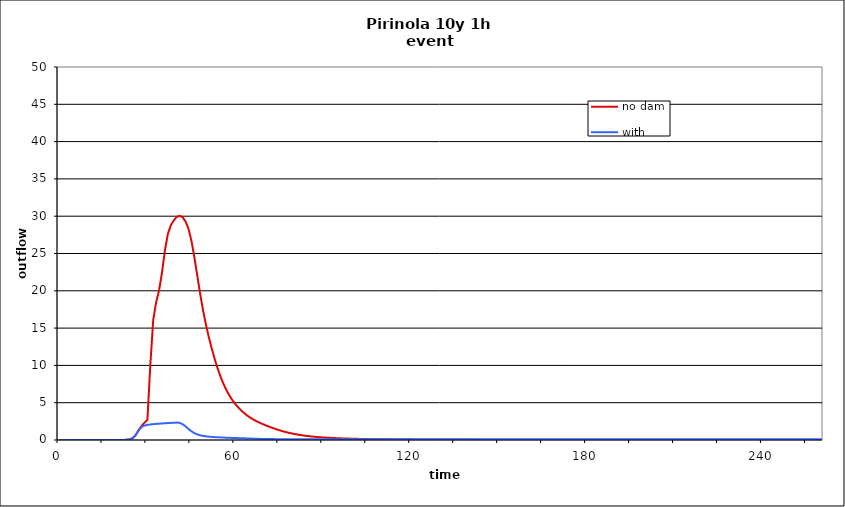
| Category | no dam | with dam |
|---|---|---|
| 0.0 | 0 | 0 |
| 1.0 | 0 | 0 |
| 2.0 | 0 | 0 |
| 3.0 | 0 | 0 |
| 4.0 | 0 | 0 |
| 5.0 | 0 | 0 |
| 6.0 | 0 | 0 |
| 7.0 | 0 | 0 |
| 8.0 | 0 | 0 |
| 9.0 | 0 | 0 |
| 10.0 | 0 | 0 |
| 11.0 | 0 | 0 |
| 12.0 | 0 | 0 |
| 13.0 | 0 | 0 |
| 14.0 | 0 | 0 |
| 15.0 | 0 | 0 |
| 16.0 | 0 | 0 |
| 17.0 | 0 | 0 |
| 18.0 | 0 | 0 |
| 19.0 | 0 | 0 |
| 20.0 | 0 | 0 |
| 21.0 | 0.002 | 0.002 |
| 22.0 | 0.01 | 0.01 |
| 23.0 | 0.037 | 0.037 |
| 24.0 | 0.088 | 0.088 |
| 25.0 | 0.271 | 0.249 |
| 26.0 | 0.672 | 0.624 |
| 27.0 | 1.334 | 1.276 |
| 28.0 | 1.887 | 1.736 |
| 29.0 | 2.307 | 1.935 |
| 30.0 | 2.689 | 2.026 |
| 31.0 | 10.1 | 2.082 |
| 32.0 | 16.131 | 2.125 |
| 33.0 | 18.484 | 2.159 |
| 34.0 | 20.099 | 2.19 |
| 35.0 | 22.505 | 2.219 |
| 36.0 | 25.489 | 2.246 |
| 37.0 | 27.645 | 2.27 |
| 38.0 | 28.788 | 2.293 |
| 39.0 | 29.443 | 2.316 |
| 40.0 | 29.899 | 2.337 |
| 41.0 | 30.048 | 2.303 |
| 42.0 | 29.859 | 2.121 |
| 43.0 | 29.318 | 1.828 |
| 44.0 | 28.336 | 1.489 |
| 45.0 | 26.744 | 1.173 |
| 46.0 | 24.56 | 0.929 |
| 47.0 | 22.075 | 0.755 |
| 48.0 | 19.6 | 0.633 |
| 49.0 | 17.356 | 0.548 |
| 50.0 | 15.411 | 0.487 |
| 51.0 | 13.714 | 0.444 |
| 52.0 | 12.189 | 0.412 |
| 53.0 | 10.8 | 0.387 |
| 54.0 | 9.549 | 0.364 |
| 55.0 | 8.439 | 0.344 |
| 56.0 | 7.479 | 0.325 |
| 57.0 | 6.649 | 0.307 |
| 58.0 | 5.94 | 0.289 |
| 59.0 | 5.333 | 0.274 |
| 60.0 | 4.816 | 0.261 |
| 61.0 | 4.364 | 0.25 |
| 62.0 | 3.966 | 0.238 |
| 63.0 | 3.611 | 0.225 |
| 64.0 | 3.297 | 0.211 |
| 65.0 | 3.02 | 0.196 |
| 66.0 | 2.776 | 0.181 |
| 67.0 | 2.561 | 0.167 |
| 68.0 | 2.366 | 0.155 |
| 69.0 | 2.188 | 0.145 |
| 70.0 | 2.023 | 0.136 |
| 71.0 | 1.866 | 0.129 |
| 72.0 | 1.718 | 0.123 |
| 73.0 | 1.576 | 0.118 |
| 74.0 | 1.441 | 0.114 |
| 75.0 | 1.315 | 0.112 |
| 76.0 | 1.198 | 0.109 |
| 77.0 | 1.091 | 0.107 |
| 78.0 | 0.992 | 0.106 |
| 79.0 | 0.902 | 0.105 |
| 80.0 | 0.82 | 0.104 |
| 81.0 | 0.745 | 0.103 |
| 82.0 | 0.677 | 0.103 |
| 83.0 | 0.616 | 0.102 |
| 84.0 | 0.561 | 0.102 |
| 85.0 | 0.513 | 0.101 |
| 86.0 | 0.47 | 0.101 |
| 87.0 | 0.432 | 0.101 |
| 88.0 | 0.399 | 0.101 |
| 89.0 | 0.369 | 0.1 |
| 90.0 | 0.342 | 0.1 |
| 91.0 | 0.317 | 0.1 |
| 92.0 | 0.295 | 0.1 |
| 93.0 | 0.274 | 0.1 |
| 94.0 | 0.256 | 0.1 |
| 95.0 | 0.238 | 0.1 |
| 96.0 | 0.222 | 0.1 |
| 97.0 | 0.208 | 0.1 |
| 98.0 | 0.194 | 0.1 |
| 99.0 | 0.182 | 0.1 |
| 100.0 | 0.17 | 0.1 |
| 101.0 | 0.159 | 0.1 |
| 102.0 | 0.149 | 0.1 |
| 103.0 | 0.14 | 0.1 |
| 104.0 | 0.132 | 0.1 |
| 105.0 | 0.124 | 0.1 |
| 106.0 | 0.116 | 0.1 |
| 107.0 | 0.109 | 0.1 |
| 108.0 | 0.103 | 0.1 |
| 109.0 | 0.097 | 0.1 |
| 110.0 | 0.091 | 0.1 |
| 111.0 | 0.086 | 0.1 |
| 112.0 | 0.081 | 0.1 |
| 113.0 | 0.077 | 0.1 |
| 114.0 | 0.072 | 0.1 |
| 115.0 | 0.068 | 0.1 |
| 116.0 | 0.065 | 0.1 |
| 117.0 | 0.061 | 0.1 |
| 118.0 | 0.058 | 0.1 |
| 119.0 | 0.055 | 0.1 |
| 120.0 | 0.052 | 0.1 |
| 121.0 | 0.049 | 0.1 |
| 122.0 | 0.046 | 0.1 |
| 123.0 | 0.044 | 0.1 |
| 124.0 | 0.042 | 0.1 |
| 125.0 | 0.04 | 0.1 |
| 126.0 | 0.038 | 0.1 |
| 127.0 | 0.036 | 0.1 |
| 128.0 | 0.034 | 0.1 |
| 129.0 | 0.032 | 0.1 |
| 130.0 | 0.031 | 0.1 |
| 131.0 | 0.029 | 0.1 |
| 132.0 | 0.028 | 0.1 |
| 133.0 | 0.026 | 0.1 |
| 134.0 | 0.025 | 0.1 |
| 135.0 | 0.024 | 0.1 |
| 136.0 | 0.023 | 0.1 |
| 137.0 | 0.022 | 0.1 |
| 138.0 | 0.021 | 0.1 |
| 139.0 | 0.02 | 0.1 |
| 140.0 | 0.019 | 0.1 |
| 141.0 | 0.018 | 0.1 |
| 142.0 | 0.017 | 0.1 |
| 143.0 | 0.017 | 0.1 |
| 144.0 | 0.016 | 0.1 |
| 145.0 | 0.015 | 0.1 |
| 146.0 | 0.015 | 0.1 |
| 147.0 | 0.014 | 0.1 |
| 148.0 | 0.013 | 0.1 |
| 149.0 | 0.013 | 0.1 |
| 150.0 | 0.012 | 0.1 |
| 151.0 | 0.012 | 0.1 |
| 152.0 | 0.011 | 0.1 |
| 153.0 | 0.011 | 0.1 |
| 154.0 | 0.01 | 0.1 |
| 155.0 | 0.01 | 0.1 |
| 156.0 | 0.009 | 0.1 |
| 157.0 | 0.009 | 0.1 |
| 158.0 | 0.008 | 0.1 |
| 159.0 | 0.008 | 0.1 |
| 160.0 | 0.008 | 0.1 |
| 161.0 | 0.007 | 0.1 |
| 162.0 | 0.007 | 0.1 |
| 163.0 | 0.007 | 0.1 |
| 164.0 | 0.006 | 0.1 |
| 165.0 | 0.006 | 0.1 |
| 166.0 | 0.006 | 0.1 |
| 167.0 | 0.005 | 0.1 |
| 168.0 | 0.005 | 0.1 |
| 169.0 | 0.005 | 0.1 |
| 170.0 | 0.005 | 0.1 |
| 171.0 | 0.004 | 0.1 |
| 172.0 | 0.004 | 0.1 |
| 173.0 | 0.004 | 0.1 |
| 174.0 | 0.004 | 0.1 |
| 175.0 | 0.004 | 0.1 |
| 176.0 | 0.003 | 0.1 |
| 177.0 | 0.003 | 0.1 |
| 178.0 | 0.003 | 0.1 |
| 179.0 | 0.003 | 0.099 |
| 180.0 | 0.003 | 0.099 |
| 181.0 | 0.003 | 0.099 |
| 182.0 | 0.002 | 0.099 |
| 183.0 | 0.002 | 0.099 |
| 184.0 | 0.002 | 0.099 |
| 185.0 | 0.002 | 0.099 |
| 186.0 | 0.002 | 0.099 |
| 187.0 | 0.002 | 0.099 |
| 188.0 | 0.002 | 0.099 |
| 189.0 | 0.001 | 0.099 |
| 190.0 | 0.001 | 0.099 |
| 191.0 | 0.001 | 0.099 |
| 192.0 | 0.001 | 0.099 |
| 193.0 | 0.001 | 0.099 |
| 194.0 | 0.001 | 0.099 |
| 195.0 | 0.001 | 0.099 |
| 196.0 | 0.001 | 0.099 |
| 197.0 | 0.001 | 0.099 |
| 198.0 | 0.001 | 0.099 |
| 199.0 | 0.001 | 0.099 |
| 200.0 | 0.001 | 0.099 |
| 201.0 | 0.001 | 0.099 |
| 202.0 | 0.001 | 0.099 |
| 203.0 | 0.001 | 0.099 |
| 204.0 | 0.001 | 0.099 |
| 205.0 | 0 | 0.099 |
| 206.0 | 0 | 0.099 |
| 207.0 | 0 | 0.099 |
| 208.0 | 0 | 0.099 |
| 209.0 | 0 | 0.099 |
| 210.0 | 0 | 0.099 |
| 211.0 | 0 | 0.099 |
| 212.0 | 0 | 0.099 |
| 213.0 | 0 | 0.099 |
| 214.0 | 0 | 0.099 |
| 215.0 | 0 | 0.099 |
| 216.0 | 0 | 0.099 |
| 217.0 | 0 | 0.099 |
| 218.0 | 0 | 0.099 |
| 219.0 | 0 | 0.099 |
| 220.0 | 0 | 0.099 |
| 221.0 | 0 | 0.099 |
| 222.0 | 0 | 0.099 |
| 223.0 | 0 | 0.099 |
| 224.0 | 0 | 0.099 |
| 225.0 | 0 | 0.099 |
| 226.0 | 0 | 0.099 |
| 227.0 | 0 | 0.099 |
| 228.0 | 0 | 0.099 |
| 229.0 | 0 | 0.099 |
| 230.0 | 0 | 0.099 |
| 231.0 | 0 | 0.099 |
| 232.0 | 0 | 0.099 |
| 233.0 | 0 | 0.099 |
| 234.0 | 0 | 0.099 |
| 235.0 | 0 | 0.099 |
| 236.0 | 0 | 0.099 |
| 237.0 | 0 | 0.099 |
| 238.0 | 0 | 0.099 |
| 239.0 | 0 | 0.099 |
| 240.0 | 0 | 0.099 |
| 241.0 | 0 | 0.099 |
| 242.0 | 0 | 0.099 |
| 243.0 | 0 | 0.099 |
| 244.0 | 0 | 0.099 |
| 245.0 | 0 | 0.099 |
| 246.0 | 0 | 0.099 |
| 247.0 | 0 | 0.099 |
| 248.0 | 0 | 0.099 |
| 249.0 | 0 | 0.099 |
| 250.0 | 0 | 0.099 |
| 251.0 | 0 | 0.099 |
| 252.0 | 0 | 0.099 |
| 253.0 | 0 | 0.099 |
| 254.0 | 0 | 0.099 |
| 255.0 | 0 | 0.099 |
| 256.0 | 0 | 0.099 |
| 257.0 | 0 | 0.099 |
| 258.0 | 0 | 0.099 |
| 259.0 | 0 | 0.099 |
| 260.0 | 0 | 0.099 |